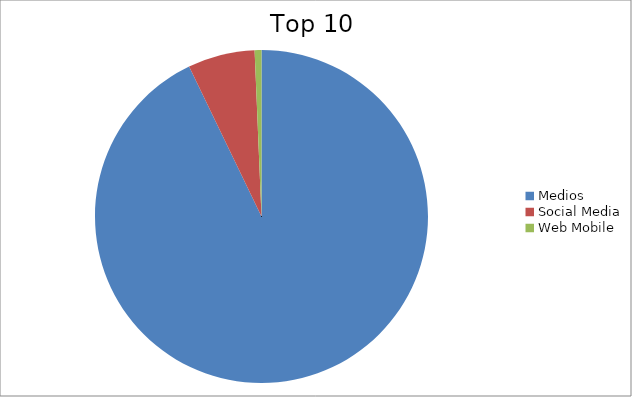
| Category | Series 0 |
|---|---|
| Medios | 92.84 |
| Social Media | 6.5 |
| Web Mobile | 0.66 |